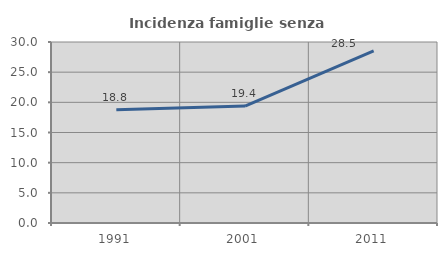
| Category | Incidenza famiglie senza nuclei |
|---|---|
| 1991.0 | 18.777 |
| 2001.0 | 19.383 |
| 2011.0 | 28.509 |